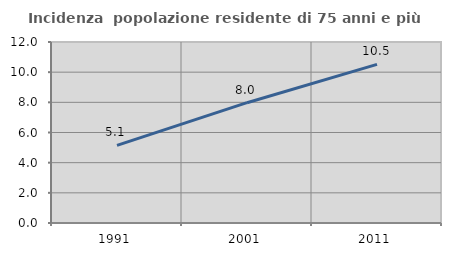
| Category | Incidenza  popolazione residente di 75 anni e più |
|---|---|
| 1991.0 | 5.141 |
| 2001.0 | 7.976 |
| 2011.0 | 10.513 |